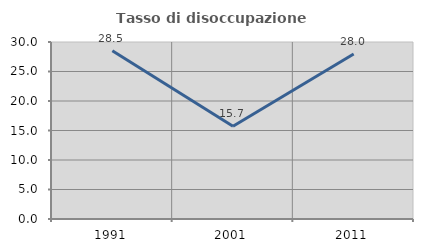
| Category | Tasso di disoccupazione giovanile  |
|---|---|
| 1991.0 | 28.514 |
| 2001.0 | 15.706 |
| 2011.0 | 27.981 |